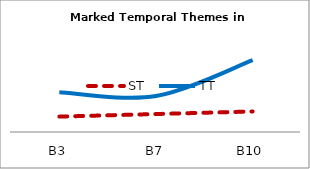
| Category | ST | TT |
|---|---|---|
| B3 | 12 | 31 |
| B7 | 14 | 28 |
| B10 | 16 | 56 |